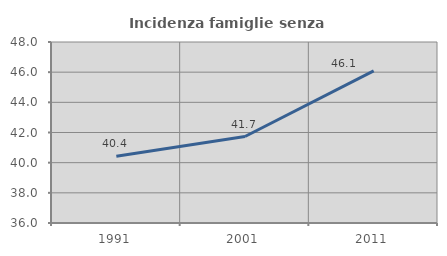
| Category | Incidenza famiglie senza nuclei |
|---|---|
| 1991.0 | 40.426 |
| 2001.0 | 41.732 |
| 2011.0 | 46.087 |